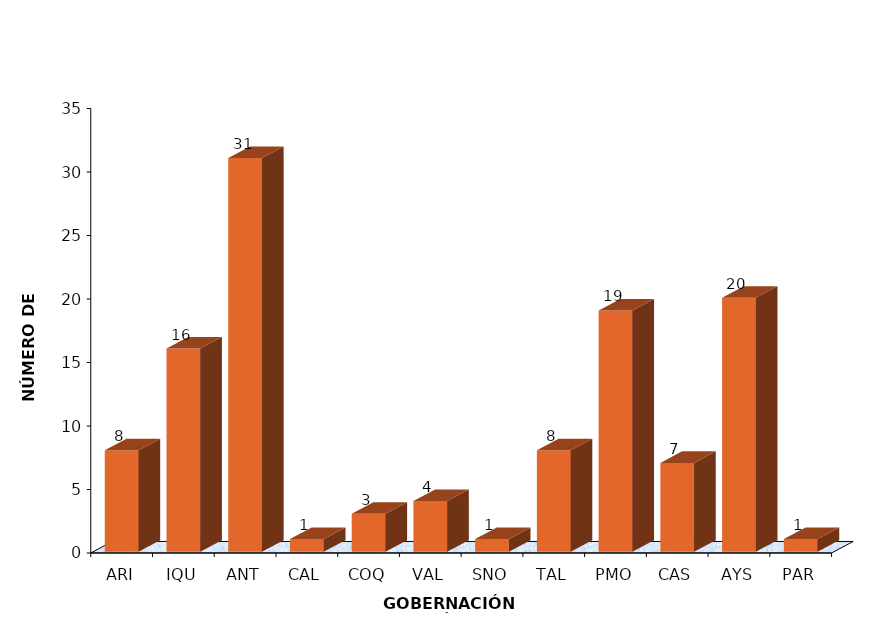
| Category | Series 0 |
|---|---|
| ARI | 8 |
| IQU | 16 |
| ANT | 31 |
| CAL | 1 |
| COQ | 3 |
| VAL | 4 |
| SNO | 1 |
| TAL | 8 |
| PMO | 19 |
| CAS | 7 |
| AYS | 20 |
| PAR | 1 |